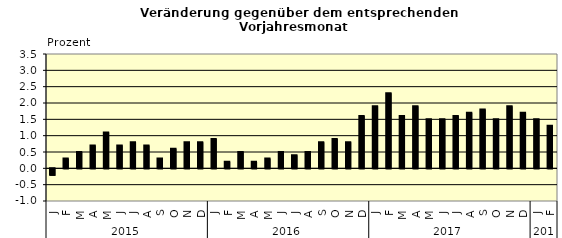
| Category | Series 0 |
|---|---|
| 0 | -0.2 |
| 1 | 0.3 |
| 2 | 0.5 |
| 3 | 0.7 |
| 4 | 1.1 |
| 5 | 0.7 |
| 6 | 0.8 |
| 7 | 0.7 |
| 8 | 0.3 |
| 9 | 0.6 |
| 10 | 0.8 |
| 11 | 0.8 |
| 12 | 0.9 |
| 13 | 0.2 |
| 14 | 0.5 |
| 15 | 0.2 |
| 16 | 0.3 |
| 17 | 0.5 |
| 18 | 0.4 |
| 19 | 0.5 |
| 20 | 0.8 |
| 21 | 0.9 |
| 22 | 0.8 |
| 23 | 1.6 |
| 24 | 1.9 |
| 25 | 2.3 |
| 26 | 1.6 |
| 27 | 1.9 |
| 28 | 1.5 |
| 29 | 1.5 |
| 30 | 1.6 |
| 31 | 1.7 |
| 32 | 1.8 |
| 33 | 1.5 |
| 34 | 1.9 |
| 35 | 1.7 |
| 36 | 1.5 |
| 37 | 1.3 |